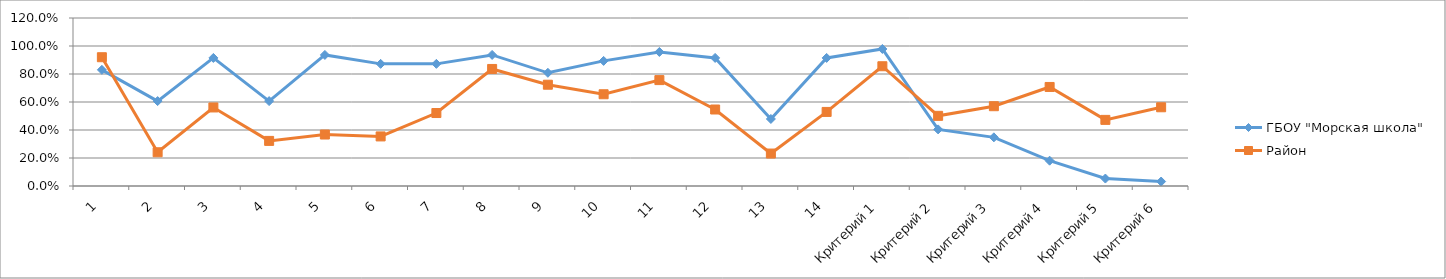
| Category | ГБОУ "Морская школа" | Район |
|---|---|---|
| 1 | 0.83 | 0.92 |
| 2 | 0.606 | 0.241 |
| 3 | 0.915 | 0.561 |
| 4 | 0.606 | 0.322 |
| 5 | 0.936 | 0.368 |
| 6 | 0.872 | 0.354 |
| 7 | 0.872 | 0.521 |
| 8 | 0.936 | 0.836 |
| 9 | 0.809 | 0.723 |
| 10 | 0.894 | 0.655 |
| 11 | 0.957 | 0.756 |
| 12 | 0.915 | 0.546 |
| 13 | 0.479 | 0.232 |
| 14 | 0.915 | 0.529 |
| Критерий 1 | 0.979 | 0.855 |
| Критерий 2 | 0.404 | 0.501 |
| Критерий 3 | 0.348 | 0.57 |
| Критерий 4 | 0.181 | 0.707 |
| Критерий 5 | 0.053 | 0.472 |
| Критерий 6 | 0.032 | 0.562 |